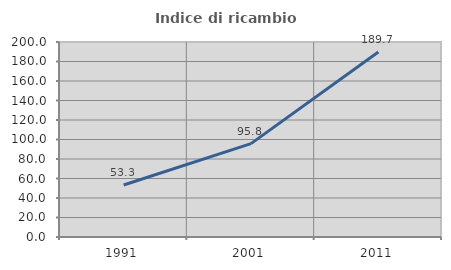
| Category | Indice di ricambio occupazionale  |
|---|---|
| 1991.0 | 53.333 |
| 2001.0 | 95.789 |
| 2011.0 | 189.744 |